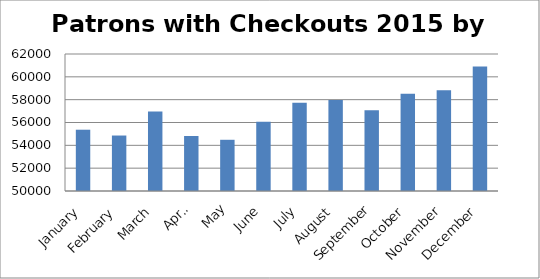
| Category | 55368 |
|---|---|
| January | 55368 |
| February | 54859 |
| March | 56953 |
| April | 54820 |
| May | 54486 |
| June | 56068 |
| July | 57731 |
| August | 57967 |
| September | 57073 |
| October | 58519 |
| November | 58829 |
| December | 60915 |